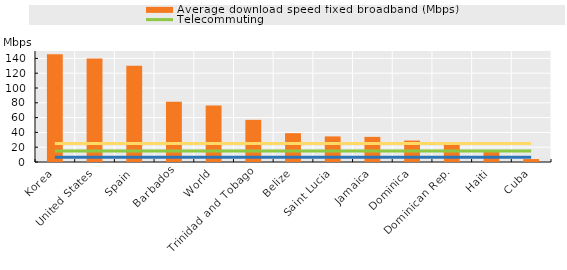
| Category | Average download speed fixed broadband (Mbps) |
|---|---|
| Korea | 145.544 |
| United States | 139.772 |
| Spain | 129.918 |
| Barbados | 81.45 |
| World | 76.514 |
| Trinidad and Tobago | 56.954 |
| Belize | 38.98 |
| Saint Lucia | 34.588 |
| Jamaica | 33.966 |
| Dominica | 28.948 |
| Dominican Rep. | 23.028 |
| Haiti | 13.812 |
| Cuba | 3.962 |